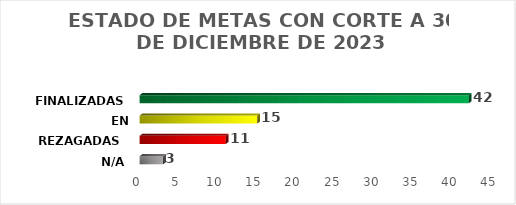
| Category | Series 0 |
|---|---|
| N/A | 3 |
| REZAGADAS  | 11 |
| EN DESARROLLO  | 15 |
| FINALIZADAS | 42 |